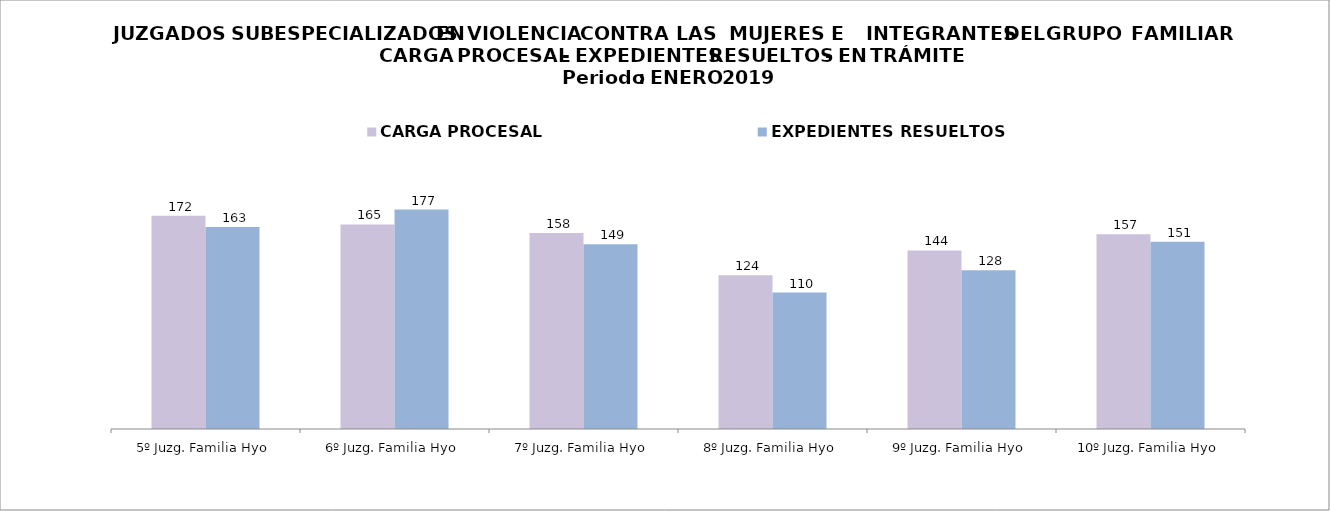
| Category | CARGA PROCESAL | EXPEDIENTES RESUELTOS |
|---|---|---|
| 5º Juzg. Familia Hyo | 172 | 163 |
| 6º Juzg. Familia Hyo | 165 | 177 |
| 7º Juzg. Familia Hyo | 158 | 149 |
| 8º Juzg. Familia Hyo | 124 | 110 |
| 9º Juzg. Familia Hyo | 144 | 128 |
| 10º Juzg. Familia Hyo | 157 | 151 |